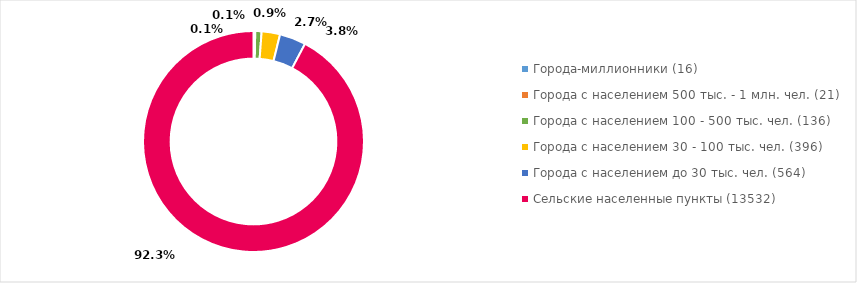
| Category | Количество НП |
|---|---|
| Города-миллионники (16) | 16 |
| Города с населением 500 тыс. - 1 млн. чел. (21) | 21 |
| Города с населением 100 - 500 тыс. чел. (136) | 136 |
| Города с населением 30 - 100 тыс. чел. (396) | 396 |
| Города с населением до 30 тыс. чел. (564) | 564 |
| Сельские населенные пункты (13532) | 13532 |